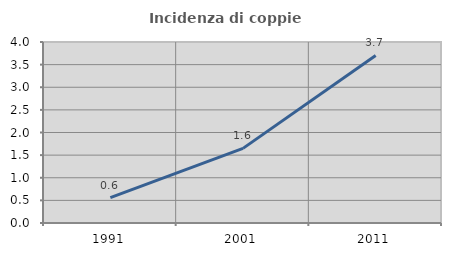
| Category | Incidenza di coppie miste |
|---|---|
| 1991.0 | 0.56 |
| 2001.0 | 1.649 |
| 2011.0 | 3.704 |